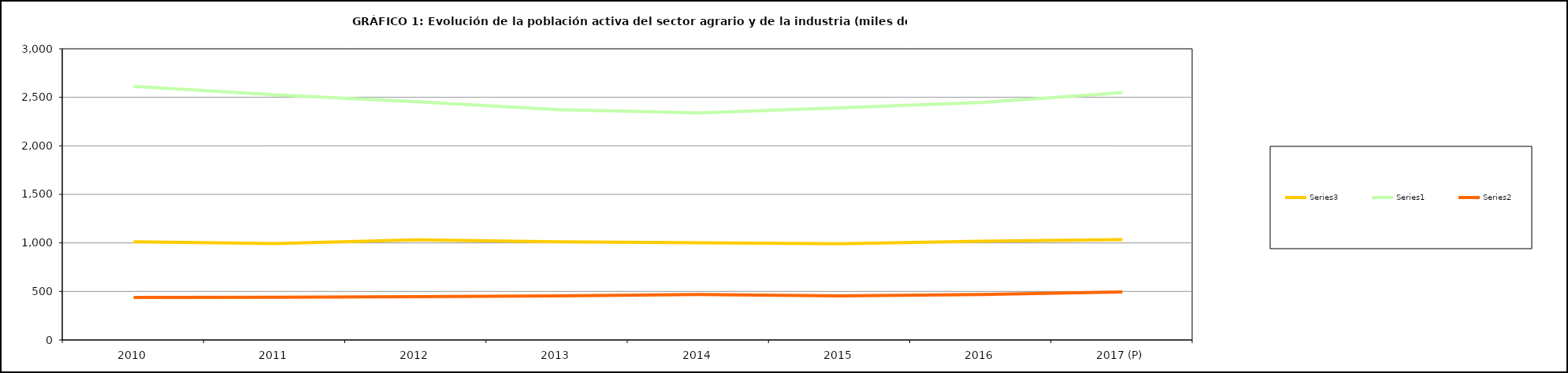
| Category | Series 3 | Series 0 | Series 1 |
|---|---|---|---|
| 2010 | 1011.9 | 2612.675 | 438.425 |
| 2011 | 993.225 | 2525.825 | 439.575 |
| 2012 | 1032.125 | 2454.25 | 445.725 |
| 2013 | 1010.5 | 2372.975 | 454.075 |
| 2014 | 1000.9 | 2339.7 | 468.5 |
| 2015 | 990.325 | 2391.725 | 454.1 |
| 2016 | 1016.75 | 2445.73 | 468.93 |
| 2017 (P) | 1034 | 2548.2 | 494.3 |